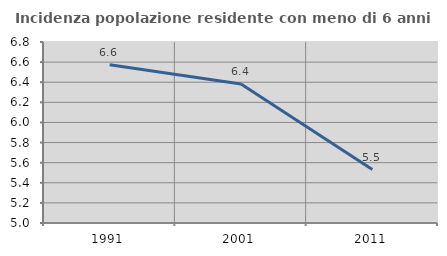
| Category | Incidenza popolazione residente con meno di 6 anni |
|---|---|
| 1991.0 | 6.574 |
| 2001.0 | 6.383 |
| 2011.0 | 5.532 |